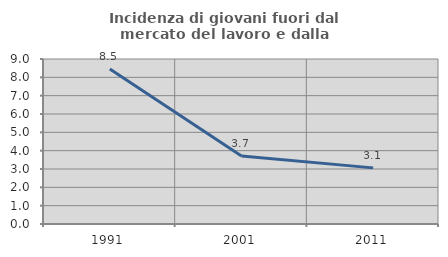
| Category | Incidenza di giovani fuori dal mercato del lavoro e dalla formazione  |
|---|---|
| 1991.0 | 8.451 |
| 2001.0 | 3.704 |
| 2011.0 | 3.061 |